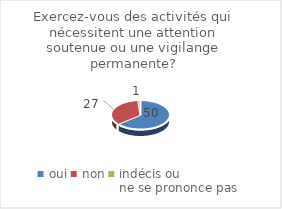
| Category | Exercevez-vous des activités qui nécessitent une attention soutenue ou une vigilange permanente? |
|---|---|
| oui | 50 |
| non | 27 |
| indécis ou 
ne se prononce pas | 1 |